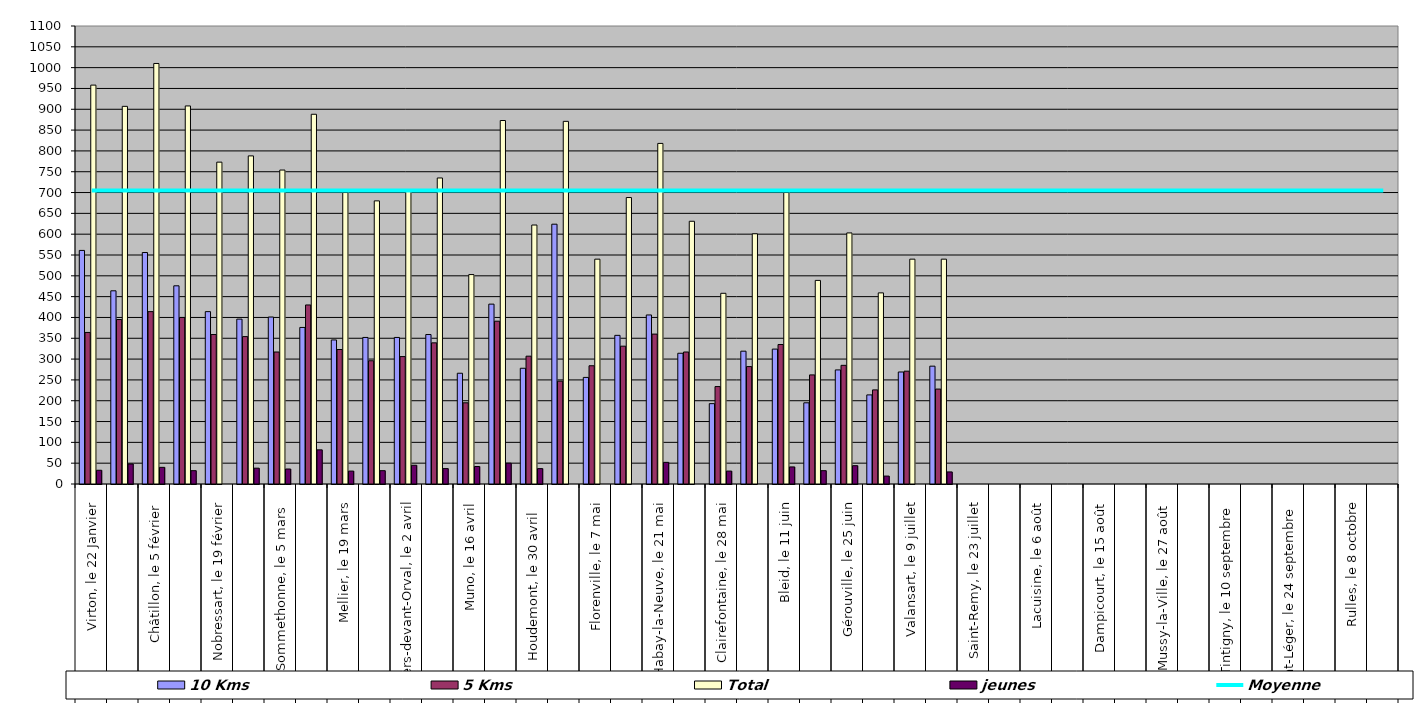
| Category | 10 Kms | 5 Kms | Total | jeunes |
|---|---|---|---|---|
| 0 | 561 | 364 | 958 | 33 |
| 1 | 464 | 395 | 907 | 48 |
| 2 | 556 | 414 | 1010 | 40 |
| 3 | 476 | 400 | 908 | 32 |
| 4 | 414 | 359 | 773 | 0 |
| 5 | 396 | 354 | 788 | 38 |
| 6 | 401 | 317 | 754 | 36 |
| 7 | 376 | 430 | 888 | 82 |
| 8 | 346 | 323 | 700 | 31 |
| 9 | 352 | 296 | 680 | 32 |
| 10 | 352 | 306 | 703 | 45 |
| 11 | 359 | 339 | 735 | 37 |
| 12 | 266 | 195 | 503 | 42 |
| 13 | 432 | 391 | 873 | 50 |
| 14 | 278 | 307 | 622 | 37 |
| 15 | 624 | 247 | 871 | 0 |
| 16 | 256 | 284 | 540 | 0 |
| 17 | 357 | 331 | 688 | 0 |
| 18 | 406 | 360 | 818 | 52 |
| 19 | 314 | 317 | 631 | 0 |
| 20 | 193 | 234 | 458 | 31 |
| 21 | 319 | 282 | 601 | 0 |
| 22 | 324 | 335 | 700 | 41 |
| 23 | 195 | 262 | 489 | 32 |
| 24 | 274 | 285 | 603 | 44 |
| 25 | 214 | 226 | 459 | 19 |
| 26 | 269 | 271 | 540 | 0 |
| 27 | 283 | 228 | 540 | 29 |
| 28 | 0 | 0 | 0 | 0 |
| 29 | 0 | 0 | 0 | 0 |
| 30 | 0 | 0 | 0 | 0 |
| 31 | 0 | 0 | 0 | 0 |
| 32 | 0 | 0 | 0 | 0 |
| 33 | 0 | 0 | 0 | 0 |
| 34 | 0 | 0 | 0 | 0 |
| 35 | 0 | 0 | 0 | 0 |
| 36 | 0 | 0 | 0 | 0 |
| 37 | 0 | 0 | 0 | 0 |
| 38 | 0 | 0 | 0 | 0 |
| 39 | 0 | 0 | 0 | 0 |
| 40 | 0 | 0 | 0 | 0 |
| 41 | 0 | 0 | 0 | 0 |